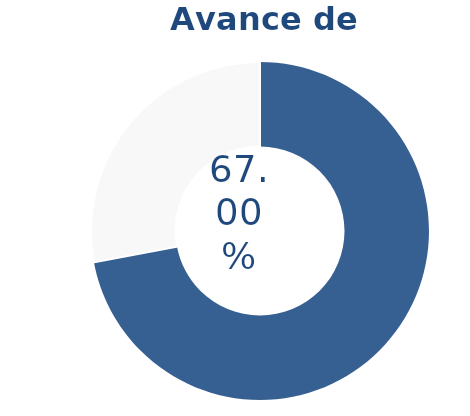
| Category | Series 0 |
|---|---|
| Acumulado 1 Trimestre | 0.67 |
| Año | -0.26 |